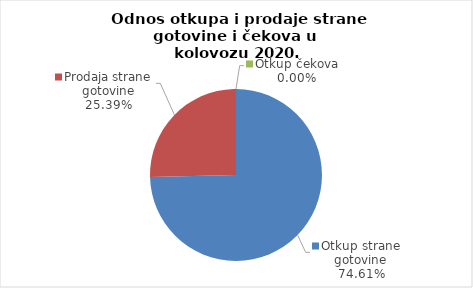
| Category | Series 0 |
|---|---|
| Otkup strane gotovine | 74.609 |
| Prodaja strane gotovine | 25.391 |
| Otkup čekova | 0 |